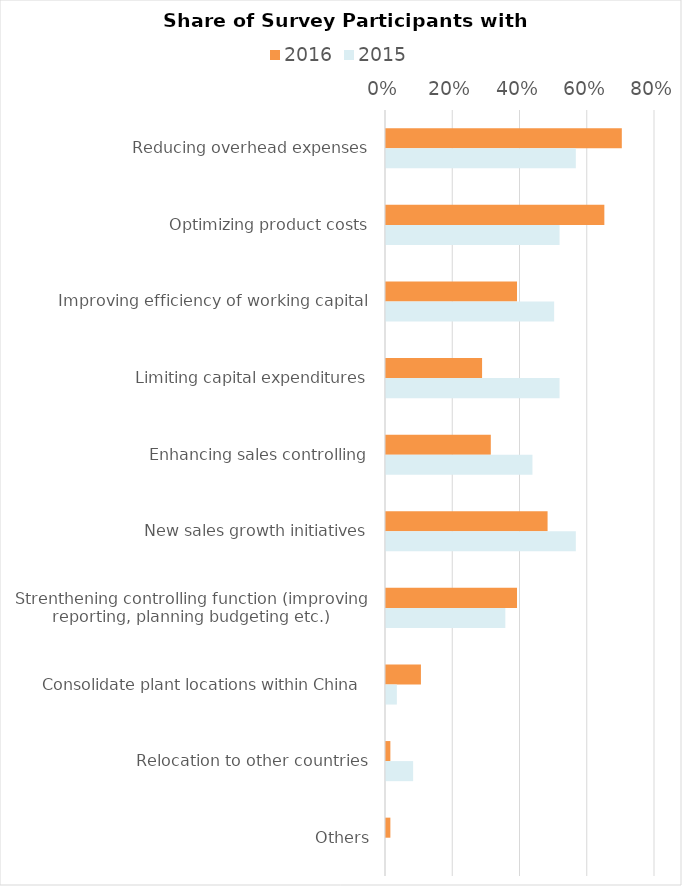
| Category | 2016 | 2015 |
|---|---|---|
| Reducing overhead expenses | 0.701 | 0.565 |
| Optimizing product costs | 0.649 | 0.516 |
| Improving efficiency of working capital | 0.39 | 0.5 |
| Limiting capital expenditures | 0.286 | 0.516 |
| Enhancing sales controlling | 0.312 | 0.435 |
| New sales growth initiatives | 0.481 | 0.565 |
| Strenthening controlling function (improving reporting, planning budgeting etc.) | 0.39 | 0.355 |
| Consolidate plant locations within China  | 0.104 | 0.032 |
| Relocation to other countries | 0.013 | 0.081 |
| Others | 0.013 | 0 |